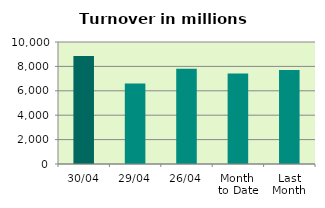
| Category | Series 0 |
|---|---|
| 30/04 | 8845.431 |
| 29/04 | 6591.341 |
| 26/04 | 7816.954 |
| Month 
to Date | 7412.755 |
| Last
Month | 7711.184 |